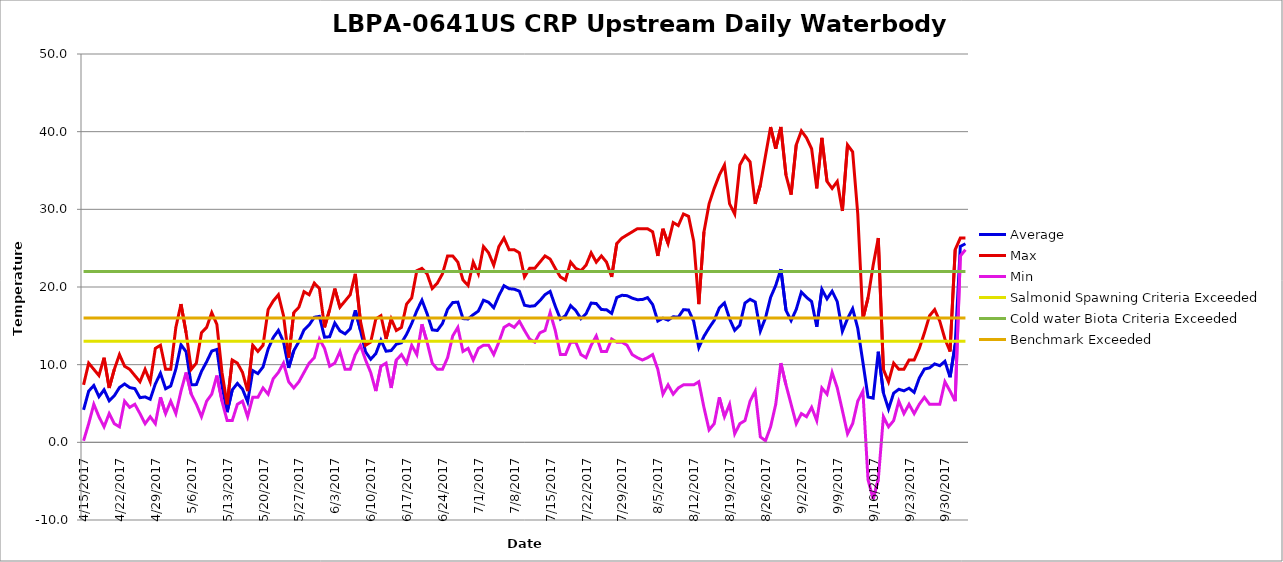
| Category | Average | Max | Min | Salmonid Spawning Criteria Exceeded | Cold water Biota Criteria Exceeded | Benchmark Exceeded |
|---|---|---|---|---|---|---|
| 4/15/17 | 4.183 | 7.4 | 0.2 | 13 | 22 | 16 |
| 4/16/17 | 6.6 | 10.2 | 2.4 | 13 | 22 | 16 |
| 4/17/17 | 7.317 | 9.4 | 4.9 | 13 | 22 | 16 |
| 4/18/17 | 5.883 | 8.6 | 3.3 | 13 | 22 | 16 |
| 4/19/17 | 6.767 | 10.9 | 2 | 13 | 22 | 16 |
| 4/20/17 | 5.35 | 7 | 3.7 | 13 | 22 | 16 |
| 4/21/17 | 6 | 9.4 | 2.4 | 13 | 22 | 16 |
| 4/22/17 | 7.05 | 11.3 | 2 | 13 | 22 | 16 |
| 4/23/17 | 7.517 | 9.8 | 5.3 | 13 | 22 | 16 |
| 4/24/17 | 7.05 | 9.4 | 4.5 | 13 | 22 | 16 |
| 4/25/17 | 6.917 | 8.6 | 4.9 | 13 | 22 | 16 |
| 4/26/17 | 5.75 | 7.8 | 3.7 | 13 | 22 | 16 |
| 4/27/17 | 5.85 | 9.4 | 2.4 | 13 | 22 | 16 |
| 4/28/17 | 5.55 | 7.8 | 3.3 | 13 | 22 | 16 |
| 4/29/17 | 7.517 | 12.1 | 2.4 | 13 | 22 | 16 |
| 4/30/17 | 8.9 | 12.5 | 5.8 | 13 | 22 | 16 |
| 5/1/17 | 6.9 | 9.4 | 3.7 | 13 | 22 | 16 |
| 5/2/17 | 7.25 | 9.4 | 5.3 | 13 | 22 | 16 |
| 5/3/17 | 9.433 | 14.8 | 3.7 | 13 | 22 | 16 |
| 5/4/17 | 12.567 | 17.8 | 6.6 | 13 | 22 | 16 |
| 5/5/17 | 11.667 | 14.1 | 9 | 13 | 22 | 16 |
| 5/6/17 | 7.4 | 9.4 | 6.2 | 13 | 22 | 16 |
| 5/7/17 | 7.433 | 10.2 | 4.9 | 13 | 22 | 16 |
| 5/8/17 | 9.133 | 14.1 | 3.3 | 13 | 22 | 16 |
| 5/9/17 | 10.367 | 14.8 | 5.3 | 13 | 22 | 16 |
| 5/10/17 | 11.75 | 16.7 | 6.2 | 13 | 22 | 16 |
| 5/11/17 | 11.967 | 15.2 | 8.6 | 13 | 22 | 16 |
| 5/12/17 | 7.25 | 9 | 5.3 | 13 | 22 | 16 |
| 5/13/17 | 3.883 | 4.9 | 2.8 | 13 | 22 | 16 |
| 5/14/17 | 6.75 | 10.6 | 2.8 | 13 | 22 | 16 |
| 5/15/17 | 7.583 | 10.2 | 4.9 | 13 | 22 | 16 |
| 5/16/17 | 6.85 | 9 | 5.3 | 13 | 22 | 16 |
| 5/17/17 | 5.217 | 6.6 | 3.3 | 13 | 22 | 16 |
| 5/18/17 | 9.233 | 12.5 | 5.8 | 13 | 22 | 16 |
| 5/19/17 | 8.85 | 11.7 | 5.8 | 13 | 22 | 16 |
| 5/20/17 | 9.7 | 12.5 | 7 | 13 | 22 | 16 |
| 5/21/17 | 12.017 | 17.1 | 6.2 | 13 | 22 | 16 |
| 5/22/17 | 13.5 | 18.2 | 8.2 | 13 | 22 | 16 |
| 5/23/17 | 14.417 | 19 | 9 | 13 | 22 | 16 |
| 5/24/17 | 12.933 | 16.3 | 10.2 | 13 | 22 | 16 |
| 5/25/17 | 9.583 | 10.9 | 7.8 | 13 | 22 | 16 |
| 5/26/17 | 11.8 | 16.7 | 7 | 13 | 22 | 16 |
| 5/27/17 | 12.967 | 17.4 | 7.8 | 13 | 22 | 16 |
| 5/28/17 | 14.483 | 19.4 | 9 | 13 | 22 | 16 |
| 5/29/17 | 15.117 | 19 | 10.2 | 13 | 22 | 16 |
| 5/30/17 | 16.1 | 20.5 | 10.9 | 13 | 22 | 16 |
| 5/31/17 | 16.217 | 19.8 | 13.3 | 13 | 22 | 16 |
| 6/1/17 | 13.533 | 14.8 | 12.1 | 13 | 22 | 16 |
| 6/2/17 | 13.6 | 17.1 | 9.8 | 13 | 22 | 16 |
| 6/3/17 | 15.367 | 19.8 | 10.2 | 13 | 22 | 16 |
| 6/4/17 | 14.35 | 17.4 | 11.7 | 13 | 22 | 16 |
| 6/5/17 | 13.967 | 18.2 | 9.4 | 13 | 22 | 16 |
| 6/6/17 | 14.6 | 19 | 9.4 | 13 | 22 | 16 |
| 6/7/17 | 17 | 21.7 | 11.3 | 13 | 22 | 16 |
| 6/8/17 | 14.433 | 15.6 | 12.5 | 13 | 22 | 16 |
| 6/9/17 | 11.65 | 12.5 | 10.6 | 13 | 22 | 16 |
| 6/10/17 | 10.7 | 12.9 | 9 | 13 | 22 | 16 |
| 6/11/17 | 11.417 | 15.9 | 6.6 | 13 | 22 | 16 |
| 6/12/17 | 13.15 | 16.3 | 9.8 | 13 | 22 | 16 |
| 6/13/17 | 11.733 | 13.3 | 10.2 | 13 | 22 | 16 |
| 6/14/17 | 11.817 | 15.9 | 7 | 13 | 22 | 16 |
| 6/15/17 | 12.633 | 14.4 | 10.6 | 13 | 22 | 16 |
| 6/16/17 | 12.817 | 14.8 | 11.3 | 13 | 22 | 16 |
| 6/17/17 | 13.9 | 17.8 | 10.2 | 13 | 22 | 16 |
| 6/18/17 | 15.3 | 18.6 | 12.5 | 13 | 22 | 16 |
| 6/19/17 | 16.95 | 22.1 | 11.3 | 13 | 22 | 16 |
| 6/20/17 | 18.3 | 22.4 | 15.2 | 13 | 22 | 16 |
| 6/21/17 | 16.567 | 21.7 | 12.9 | 13 | 22 | 16 |
| 6/22/17 | 14.483 | 19.8 | 10.2 | 13 | 22 | 16 |
| 6/23/17 | 14.4 | 20.5 | 9.4 | 13 | 22 | 16 |
| 6/24/17 | 15.3 | 21.7 | 9.4 | 13 | 22 | 16 |
| 6/25/17 | 17.133 | 24 | 10.9 | 13 | 22 | 16 |
| 6/26/17 | 18 | 24 | 13.7 | 13 | 22 | 16 |
| 6/27/17 | 18.05 | 23.2 | 14.8 | 13 | 22 | 16 |
| 6/28/17 | 15.933 | 20.9 | 11.7 | 13 | 22 | 16 |
| 6/29/17 | 15.883 | 20.2 | 12.1 | 13 | 22 | 16 |
| 6/30/17 | 16.433 | 23.2 | 10.6 | 13 | 22 | 16 |
| 7/1/17 | 16.9 | 21.7 | 12.1 | 13 | 22 | 16 |
| 7/2/17 | 18.3 | 25.2 | 12.5 | 13 | 22 | 16 |
| 7/3/17 | 18.033 | 24.4 | 12.5 | 13 | 22 | 16 |
| 7/4/17 | 17.333 | 22.8 | 11.3 | 13 | 22 | 16 |
| 7/5/17 | 18.883 | 25.2 | 12.9 | 13 | 22 | 16 |
| 7/6/17 | 20.167 | 26.3 | 14.8 | 13 | 22 | 16 |
| 7/7/17 | 19.783 | 24.8 | 15.2 | 13 | 22 | 16 |
| 7/8/17 | 19.717 | 24.8 | 14.8 | 13 | 22 | 16 |
| 7/9/17 | 19.467 | 24.4 | 15.6 | 13 | 22 | 16 |
| 7/10/17 | 17.65 | 21.3 | 14.4 | 13 | 22 | 16 |
| 7/11/17 | 17.517 | 22.4 | 13.3 | 13 | 22 | 16 |
| 7/12/17 | 17.583 | 22.4 | 12.9 | 13 | 22 | 16 |
| 7/13/17 | 18.233 | 23.2 | 14.1 | 13 | 22 | 16 |
| 7/14/17 | 19.017 | 24 | 14.4 | 13 | 22 | 16 |
| 7/15/17 | 19.433 | 23.6 | 16.7 | 13 | 22 | 16 |
| 7/16/17 | 17.533 | 22.4 | 14.4 | 13 | 22 | 16 |
| 7/17/17 | 15.867 | 21.3 | 11.3 | 13 | 22 | 16 |
| 7/18/17 | 16.317 | 20.9 | 11.3 | 13 | 22 | 16 |
| 7/19/17 | 17.6 | 23.2 | 12.9 | 13 | 22 | 16 |
| 7/20/17 | 16.967 | 22.4 | 12.9 | 13 | 22 | 16 |
| 7/21/17 | 15.933 | 22.1 | 11.3 | 13 | 22 | 16 |
| 7/22/17 | 16.55 | 22.8 | 10.9 | 13 | 22 | 16 |
| 7/23/17 | 17.933 | 24.4 | 12.5 | 13 | 22 | 16 |
| 7/24/17 | 17.867 | 23.2 | 13.7 | 13 | 22 | 16 |
| 7/25/17 | 17.1 | 24 | 11.7 | 13 | 22 | 16 |
| 7/26/17 | 17.067 | 23.2 | 11.7 | 13 | 22 | 16 |
| 7/27/17 | 16.6 | 21.3 | 13.3 | 13 | 22 | 16 |
| 7/28/17 | 18.65 | 25.6 | 12.9 | 13 | 22 | 16 |
| 7/29/17 | 18.933 | 26.3 | 12.9 | 13 | 22 | 16 |
| 7/30/17 | 18.883 | 26.7 | 12.5 | 13 | 22 | 16 |
| 7/31/17 | 18.567 | 27.1 | 11.3 | 13 | 22 | 16 |
| 8/1/17 | 18.367 | 27.5 | 10.9 | 13 | 22 | 16 |
| 8/2/17 | 18.383 | 27.5 | 10.6 | 13 | 22 | 16 |
| 8/3/17 | 18.633 | 27.5 | 10.9 | 13 | 22 | 16 |
| 8/4/17 | 17.733 | 27.1 | 11.3 | 13 | 22 | 16 |
| 8/5/17 | 15.617 | 24 | 9.4 | 13 | 22 | 16 |
| 8/6/17 | 15.983 | 27.5 | 6.2 | 13 | 22 | 16 |
| 8/7/17 | 15.733 | 25.6 | 7.4 | 13 | 22 | 16 |
| 8/8/17 | 16.167 | 28.3 | 6.2 | 13 | 22 | 16 |
| 8/9/17 | 16.117 | 27.9 | 7 | 13 | 22 | 16 |
| 8/10/17 | 17.083 | 29.4 | 7.4 | 13 | 22 | 16 |
| 8/11/17 | 17.033 | 29.1 | 7.4 | 13 | 22 | 16 |
| 8/12/17 | 15.583 | 25.9 | 7.4 | 13 | 22 | 16 |
| 8/13/17 | 12.2 | 17.8 | 7.8 | 13 | 22 | 16 |
| 8/14/17 | 13.65 | 27.1 | 4.5 | 13 | 22 | 16 |
| 8/15/17 | 14.733 | 30.7 | 1.6 | 13 | 22 | 16 |
| 8/16/17 | 15.7 | 32.7 | 2.4 | 13 | 22 | 16 |
| 8/17/17 | 17.317 | 34.4 | 5.8 | 13 | 22 | 16 |
| 8/18/17 | 17.95 | 35.7 | 3.3 | 13 | 22 | 16 |
| 8/19/17 | 15.9 | 30.7 | 4.9 | 13 | 22 | 16 |
| 8/20/17 | 14.417 | 29.4 | 1.1 | 13 | 22 | 16 |
| 8/21/17 | 15.1 | 35.7 | 2.4 | 13 | 22 | 16 |
| 8/22/17 | 17.933 | 36.9 | 2.8 | 13 | 22 | 16 |
| 8/23/17 | 18.417 | 36.1 | 5.3 | 13 | 22 | 16 |
| 8/24/17 | 18.067 | 30.7 | 6.6 | 13 | 22 | 16 |
| 8/25/17 | 14.333 | 33.1 | 0.7 | 13 | 22 | 16 |
| 8/26/17 | 16.017 | 36.9 | 0.2 | 13 | 22 | 16 |
| 8/27/17 | 18.667 | 40.6 | 2 | 13 | 22 | 16 |
| 8/28/17 | 20.2 | 37.8 | 4.9 | 13 | 22 | 16 |
| 8/29/17 | 22.3 | 40.6 | 10.2 | 13 | 22 | 16 |
| 8/30/17 | 17 | 34.4 | 7.4 | 13 | 22 | 16 |
| 8/31/17 | 15.683 | 31.9 | 4.9 | 13 | 22 | 16 |
| 9/1/17 | 17.117 | 38.3 | 2.4 | 13 | 22 | 16 |
| 9/2/17 | 19.35 | 40.1 | 3.7 | 13 | 22 | 16 |
| 9/3/17 | 18.667 | 39.2 | 3.3 | 13 | 22 | 16 |
| 9/4/17 | 18.133 | 37.8 | 4.5 | 13 | 22 | 16 |
| 9/5/17 | 14.883 | 32.7 | 2.8 | 13 | 22 | 16 |
| 9/6/17 | 19.7 | 39.2 | 7 | 13 | 22 | 16 |
| 9/7/17 | 18.467 | 33.6 | 6.2 | 13 | 22 | 16 |
| 9/8/17 | 19.467 | 32.7 | 9 | 13 | 22 | 16 |
| 9/9/17 | 18.117 | 33.6 | 7 | 13 | 22 | 16 |
| 9/10/17 | 14.283 | 29.8 | 4.1 | 13 | 22 | 16 |
| 9/11/17 | 15.917 | 38.3 | 1.1 | 13 | 22 | 16 |
| 9/12/17 | 17.217 | 37.4 | 2.4 | 13 | 22 | 16 |
| 9/13/17 | 14.667 | 29.4 | 5.3 | 13 | 22 | 16 |
| 9/14/17 | 10.317 | 15.9 | 6.6 | 13 | 22 | 16 |
| 9/15/17 | 5.85 | 18.6 | -4.8 | 13 | 22 | 16 |
| 9/16/17 | 5.7 | 22.8 | -7.3 | 13 | 22 | 16 |
| 9/17/17 | 11.667 | 26.3 | -4.8 | 13 | 22 | 16 |
| 9/18/17 | 6.367 | 9.4 | 3.3 | 13 | 22 | 16 |
| 9/19/17 | 4.283 | 7.8 | 2 | 13 | 22 | 16 |
| 9/20/17 | 6.333 | 10.2 | 2.8 | 13 | 22 | 16 |
| 9/21/17 | 6.833 | 9.4 | 5.3 | 13 | 22 | 16 |
| 9/22/17 | 6.633 | 9.4 | 3.7 | 13 | 22 | 16 |
| 9/23/17 | 6.967 | 10.6 | 4.9 | 13 | 22 | 16 |
| 9/24/17 | 6.433 | 10.6 | 3.7 | 13 | 22 | 16 |
| 9/25/17 | 8.283 | 12.1 | 4.9 | 13 | 22 | 16 |
| 9/26/17 | 9.433 | 14.1 | 5.8 | 13 | 22 | 16 |
| 9/27/17 | 9.583 | 16.3 | 4.9 | 13 | 22 | 16 |
| 9/28/17 | 10.1 | 17.1 | 4.9 | 13 | 22 | 16 |
| 9/29/17 | 9.867 | 15.6 | 4.9 | 13 | 22 | 16 |
| 9/30/17 | 10.433 | 13.3 | 7.8 | 13 | 22 | 16 |
| 10/1/17 | 8.383 | 11.7 | 6.6 | 13 | 22 | 16 |
| 10/2/17 | 12.583 | 24.8 | 5.3 | 13 | 22 | 16 |
| 10/3/17 | 25.217 | 26.3 | 24 | 13 | 22 | 16 |
| 10/4/17 | 25.567 | 26.3 | 24.8 | 13 | 22 | 16 |